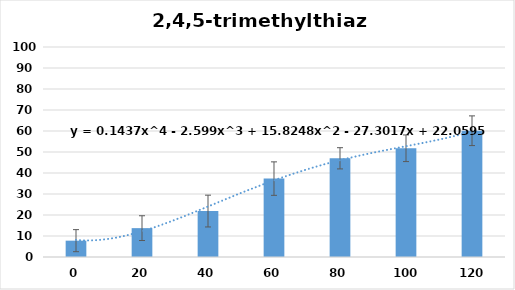
| Category | Series 0 |
|---|---|
| 0.0 | 7.778 |
| 20.0 | 13.744 |
| 40.0 | 21.875 |
| 60.0 | 37.333 |
| 80.0 | 47 |
| 100.0 | 51.778 |
| 120.0 | 60.125 |